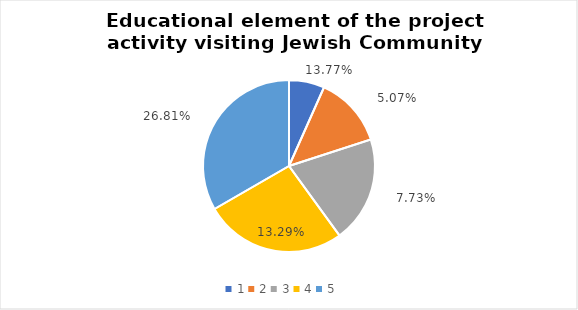
| Category | Series 0 | Series 1 |
|---|---|---|
| 0 | 1 | 0.138 |
| 1 | 2 | 0.051 |
| 2 | 3 | 0.077 |
| 3 | 4 | 0.133 |
| 4 | 5 | 0.268 |